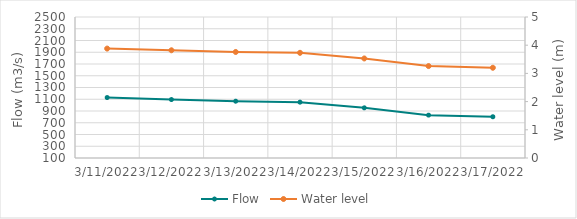
| Category | Flow |
|---|---|
| 2/23/22 | 429.83 |
| 2/22/22 | 461.67 |
| 2/21/22 | 513.39 |
| 2/20/22 | 590.14 |
| 2/19/22 | 638.26 |
| 2/18/22 | 615.14 |
| 2/17/22 | 610.53 |